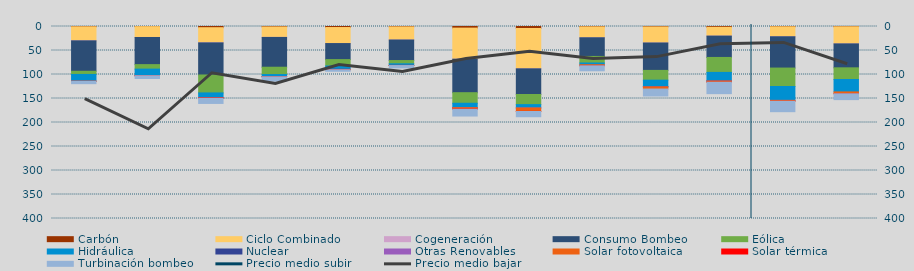
| Category | Carbón | Ciclo Combinado | Cogeneración | Consumo Bombeo | Eólica | Hidráulica | Nuclear | Otras Renovables | Solar fotovoltaica | Solar térmica | Turbinación bombeo |
|---|---|---|---|---|---|---|---|---|---|---|---|
| F | 596.6 | 29112.7 | 204.1 | 63351.9 | 6588.8 | 14242.2 | 0 | 0 | 6.8 | 5.7 | 5009.4 |
| M | 303.5 | 22485.8 | 115.8 | 56511.7 | 9357.1 | 13652.7 | 0 | 45.9 | 36.9 | 12.5 | 5840.6 |
| A | 2494.9 | 31290.063 | 376.8 | 66847.891 | 37361.887 | 10548.549 | 58.3 | 29.1 | 101.167 | 483.9 | 10705.8 |
| M | 916.05 | 21695.666 | 176.35 | 62054.792 | 15250.739 | 4379.143 | 0 | 39.1 | 143.784 | 110.5 | 9070.525 |
| J | 2154.975 | 33372.05 | 35.5 | 33404.025 | 13344.6 | 6713.425 | 395.875 | 16.375 | 385.65 | 221.25 | 3231.725 |
| J | 780.225 | 27400.075 | 8 | 42750.35 | 6759.125 | 3263.775 | 115 | 0 | 90.1 | 206.65 | 4895.275 |
| A | 3351.92 | 64804.475 | 20.75 | 69703.55 | 22031.853 | 9149.525 | 70.975 | 22.5 | 2685.85 | 505.375 | 14186.525 |
| S | 4138.5 | 84055.788 | 26 | 53462.35 | 21071.172 | 6988.753 | 0 | 0.85 | 7069.199 | 219.625 | 10948.251 |
| O | 766.425 | 22723.1 | 23.25 | 38873.508 | 13638.3 | 3548.975 | 0 | 0 | 2254.075 | 15.75 | 10421.953 |
| N | 882.249 | 33437.299 | 73.35 | 57054.7 | 20324.708 | 13802.882 | 172 | 5.375 | 4519.267 | 0 | 14514.075 |
| D | 1625.533 | 18353.308 | 50.675 | 44452.158 | 31169.809 | 17718.259 | 225.525 | 7.75 | 2457.35 | 4.225 | 23848.4 |
| E | 588.4 | 20714.524 | 113.817 | 65169.007 | 38379.733 | 28985.1 | 0 | 1 | 1727.433 | 24.9 | 21766.958 |
| F | 573.3 | 35655.65 | 48.25 | 49817.85 | 24354.625 | 25831 | 0 | 0 | 3770.725 | 69.225 | 12196.8 |